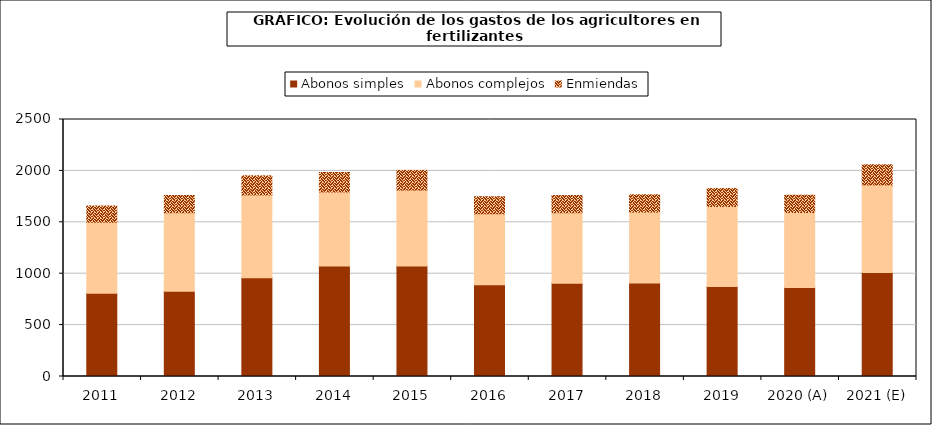
| Category | Abonos simples | Abonos complejos | Enmiendas |
|---|---|---|---|
| 2011 | 809.32 | 692.087 | 157.487 |
| 2012 | 828.171 | 764.88 | 167.637 |
| 2013 | 959.679 | 806.665 | 185.766 |
| 2014 | 1074.953 | 720.53 | 188.831 |
| 2015 | 1074.955 | 739.068 | 190.781 |
| 2016 | 891.426 | 691.817 | 166.51 |
| 2017 | 906.183 | 686.53 | 167.506 |
| 2018 | 908.668 | 690.56 | 168.191 |
| 2019 | 876.483 | 777.519 | 173.951 |
| 2020 (A) | 865.506 | 730.041 | 167.804 |
| 2021 (E) | 1010.754 | 852.556 | 195.964 |